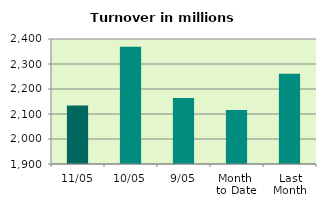
| Category | Series 0 |
|---|---|
| 11/05 | 2134.341 |
| 10/05 | 2368.824 |
| 9/05 | 2164.25 |
| Month 
to Date | 2116.293 |
| Last
Month | 2261.282 |